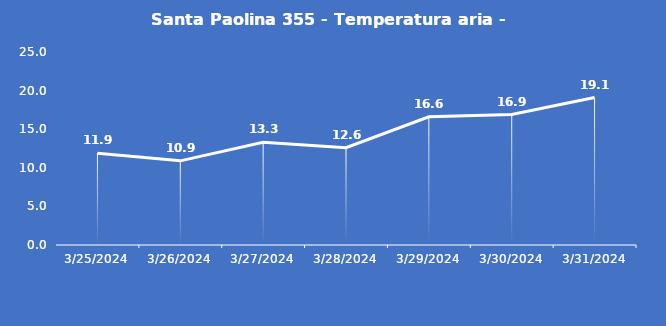
| Category | Santa Paolina 355 - Temperatura aria - Grezzo (°C) |
|---|---|
| 3/25/24 | 11.9 |
| 3/26/24 | 10.9 |
| 3/27/24 | 13.3 |
| 3/28/24 | 12.6 |
| 3/29/24 | 16.6 |
| 3/30/24 | 16.9 |
| 3/31/24 | 19.1 |